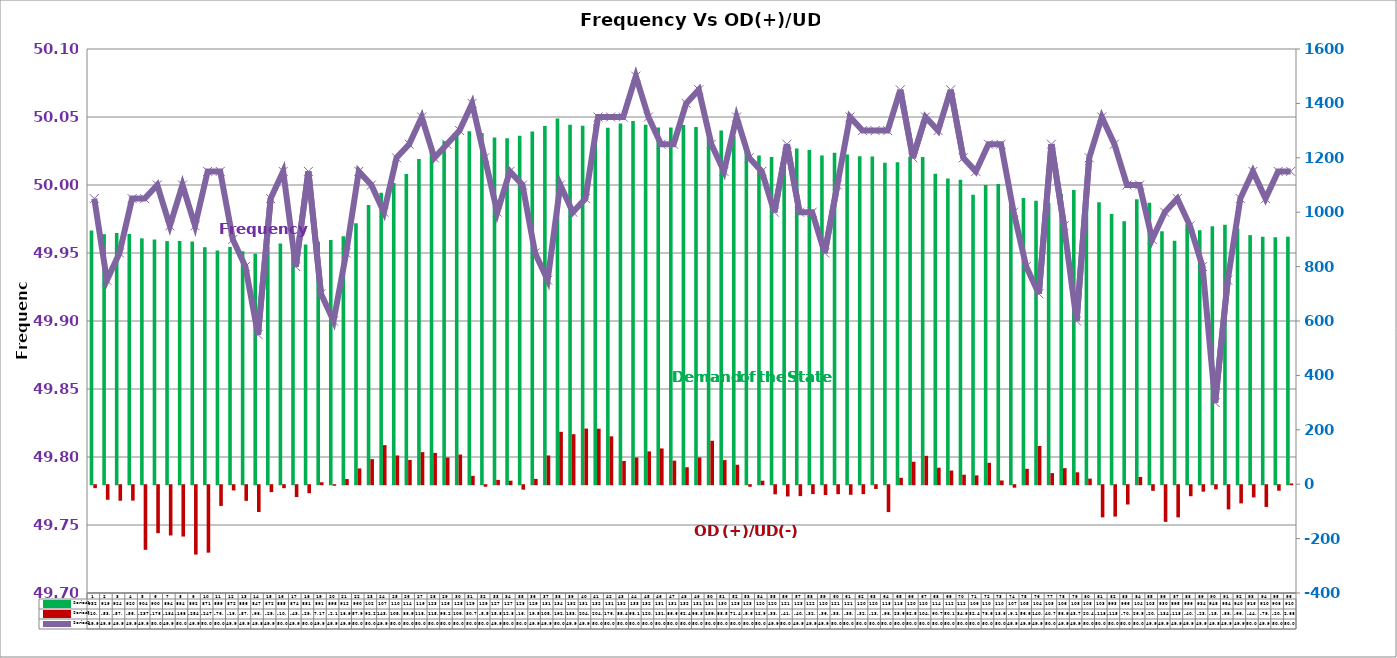
| Category | Series 2 | Series 4 |
|---|---|---|
| 0 | 932.36 | -10.87 |
| 1 | 919.2 | -53.39 |
| 2 | 923.66 | -57.05 |
| 3 | 919.92 | -56.65 |
| 4 | 903.87 | -237.52 |
| 5 | 899.54 | -176.3 |
| 6 | 893.73 | -184.87 |
| 7 | 893.73 | -188.74 |
| 8 | 892.19 | -254.99 |
| 9 | 871.26 | -247.97 |
| 10 | 859.01 | -76.23 |
| 11 | 872.3 | -19.23 |
| 12 | 856.14 | -57.45 |
| 13 | 846.89 | -98.47 |
| 14 | 872.01 | -25.46 |
| 15 | 884.61 | -10.94 |
| 16 | 874.19 | -43.6 |
| 17 | 881.17 | -29.36 |
| 18 | 891.49 | 7.17 |
| 19 | 897.82 | -2.15 |
| 20 | 911.86 | 18.9 |
| 21 | 959.7 | 57.95 |
| 22 | 1026.08 | 92.27 |
| 23 | 1071.43 | 143.67 |
| 24 | 1107.43 | 105.75 |
| 25 | 1140.69 | 88.97 |
| 26 | 1195.68 | 118.02 |
| 27 | 1234.57 | 115.05 |
| 28 | 1260.71 | 98.25 |
| 29 | 1284.89 | 109.1 |
| 30 | 1297.43 | 30.7 |
| 31 | 1291.34 | -5.52 |
| 32 | 1274.65 | 15.89 |
| 33 | 1271.7 | 12.89 |
| 34 | 1281.12 | -16.41 |
| 35 | 1297.1 | 19.5 |
| 36 | 1316.97 | 105.64 |
| 37 | 1344.41 | 192.6 |
| 38 | 1321.34 | 183.82 |
| 39 | 1318 | 204.56 |
| 40 | 1325.15 | 204.13 |
| 41 | 1310.43 | 176.03 |
| 42 | 1325.9 | 85.42 |
| 43 | 1335.57 | 98.18 |
| 44 | 1321.91 | 120.64 |
| 45 | 1311.04 | 131.5 |
| 46 | 1310.97 | 86.61 |
| 47 | 1320.98 | 62.43 |
| 48 | 1312.98 | 98.36 |
| 49 | 1312.55 | 159.77 |
| 50 | 1299.99 | 88.58 |
| 51 | 1279.95 | 71.46 |
| 52 | 1237.7 | -5.69 |
| 53 | 1208.88 | 12.93 |
| 54 | 1203.35 | -33.49 |
| 55 | 1212.91 | -41.35 |
| 56 | 1234.29 | -40.22 |
| 57 | 1229 | -32.56 |
| 58 | 1208.77 | -36.04 |
| 59 | 1218.13 | -33 |
| 60 | 1211.83 | -35.22 |
| 61 | 1205.74 | -32.97 |
| 62 | 1204.71 | -13.82 |
| 63 | 1181.75 | -98.92 |
| 64 | 1183.61 | 23.6 |
| 65 | 1204.01 | 82.5 |
| 66 | 1202.98 | 104.36 |
| 67 | 1141.06 | 60.72 |
| 68 | 1124.19 | 50.16 |
| 69 | 1119.74 | 34.92 |
| 70 | 1064.04 | 32.49 |
| 71 | 1100.12 | 78.66 |
| 72 | 1103.92 | 13.69 |
| 73 | 1077.31 | -9.13 |
| 74 | 1052.48 | 56.63 |
| 75 | 1042.04 | 140.37 |
| 76 | 1033.42 | 40.78 |
| 77 | 1066.98 | 58.94 |
| 78 | 1081.95 | 43.76 |
| 79 | 1081.76 | 20.42 |
| 80 | 1036.77 | -118.27 |
| 81 | 992.93 | -115.35 |
| 82 | 966.33 | -70.91 |
| 83 | 1047.37 | 26.86 |
| 84 | 1034.66 | -20.67 |
| 85 | 929.92 | -134.81 |
| 86 | 895.21 | -118.22 |
| 87 | 955.67 | -40.58 |
| 88 | 933.88 | -23.76 |
| 89 | 948.19 | -15.25 |
| 90 | 953.63 | -88.96 |
| 91 | 939.88 | -66.92 |
| 92 | 915.75 | -44.72 |
| 93 | 909.91 | -79.88 |
| 94 | 908 | -20.17 |
| 95 | 909.99 | 2.68 |